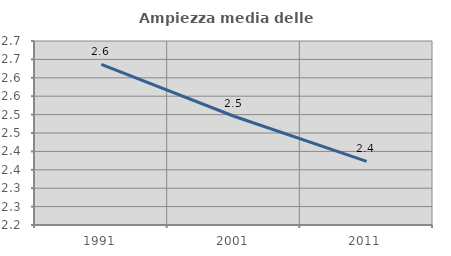
| Category | Ampiezza media delle famiglie |
|---|---|
| 1991.0 | 2.637 |
| 2001.0 | 2.495 |
| 2011.0 | 2.373 |